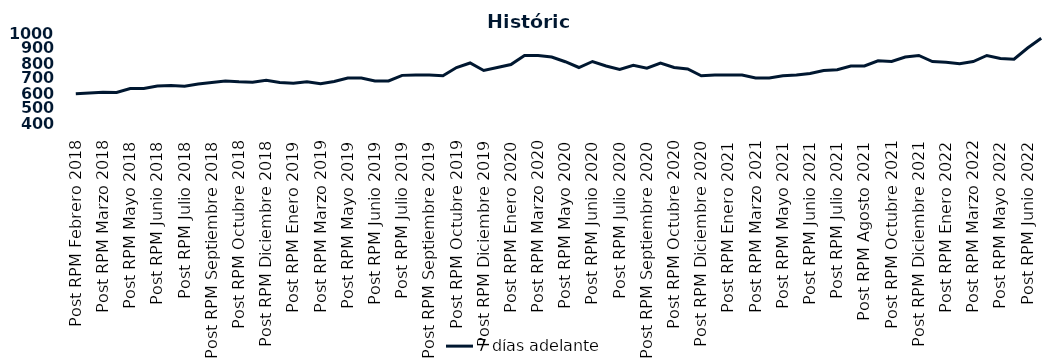
| Category | 7 días adelante  |
|---|---|
| Post RPM Febrero 2018 | 595 |
| Pre RPM Marzo 2018 | 600 |
| Post RPM Marzo 2018 | 605 |
| Pre RPM Mayo 2018 | 603 |
| Post RPM Mayo 2018 | 630 |
| Pre RPM Junio 2018 | 630 |
| Post RPM Junio 2018 | 646.5 |
| Pre RPM Julio 2018 | 650 |
| Post RPM Julio 2018 | 645 |
| Pre RPM Septiembre 2018 | 660 |
| Post RPM Septiembre 2018 | 670 |
| Pre RPM Octubre 2018 | 680 |
| Post RPM Octubre 2018 | 675 |
| Pre RPM Diciembre 2018 | 672.5 |
| Post RPM Diciembre 2018 | 685 |
| Pre RPM Enero 2019 | 670 |
| Post RPM Enero 2019 | 665 |
| Pre RPM Marzo 2019 | 675 |
| Post RPM Marzo 2019 | 661 |
| Pre RPM Mayo 2019 | 677 |
| Post RPM Mayo 2019 | 700 |
| Pre RPM Junio 2019 | 700.5 |
| Post RPM Junio 2019 | 680 |
| Pre RPM Julio 2019 | 680 |
| Post RPM Julio 2019 | 717.5 |
| Pre RPM Septiembre 2019 | 720 |
| Post RPM Septiembre 2019 | 720 |
| Pre RPM Octubre 2019 | 715 |
| Post RPM Octubre 2019 | 770 |
| Pre RPM Diciembre 2019 | 800 |
| Post RPM Diciembre 2019 | 750 |
| Pre RPM Enero 2020 | 770 |
| Post RPM Enero 2020 | 790 |
| Pre RPM Marzo 2020 | 850 |
| Post RPM Marzo 2020 | 850 |
| Pre RPM Mayo 2020 | 840 |
| Post RPM Mayo 2020 | 808.5 |
| Pre RPM Junio 2020 | 770 |
| Post RPM Junio 2020 | 810 |
| Pre RPM Julio 2020 | 780 |
| Post RPM Julio 2020 | 757 |
| Pre RPM Septiembre 2020 | 785 |
| Post RPM Septiembre 2020 | 765 |
| Pre RPM Octubre 2020 | 800 |
| Post RPM Octubre 2020 | 770 |
| Pre RPM Diciembre 2020 | 760 |
| Post RPM Diciembre 2020 | 715 |
| Pre RPM Enero 2021 | 720 |
| Post RPM Enero 2021 | 720 |
| Pre RPM Marzo 2021 | 720 |
| Post RPM Marzo 2021 | 700 |
| Pre RPM Mayo 2021 | 700 |
| Post RPM Mayo 2021 | 715 |
| Pre RPM Junio 2021 | 720 |
| Post RPM Junio 2021 | 730 |
| Pre RPM Julio 2021 | 750 |
| Post RPM Julio 2021 | 755 |
| Pre RPM Agosto 2021 | 780 |
| Post RPM Agosto 2021 | 780 |
| Pre RPM Octubre 2021 | 815 |
| Post RPM Octubre 2021 | 810 |
| Pre RPM Diciembre 2021 | 840 |
| Post RPM Diciembre 2021 | 850 |
| Pre RPM Enero 2022 | 810 |
| Post RPM Enero 2022 | 805 |
| Pre RPM Marzo 2022 | 795 |
| Post RPM Marzo 2022 | 810 |
| Pre RPM Mayo 2022 | 850 |
| Post RPM Mayo 2022 | 830 |
| Pre RPM Junio 2022 | 825 |
| Post RPM Junio 2022 | 900 |
| Pre RPM Julio 2022 | 965 |